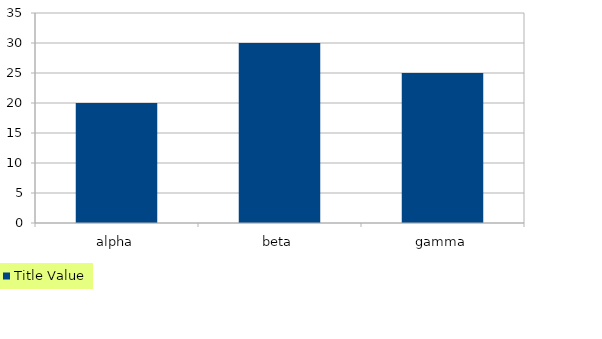
| Category | Value |
|---|---|
| alpha | 20 |
| beta | 30 |
| gamma | 25 |